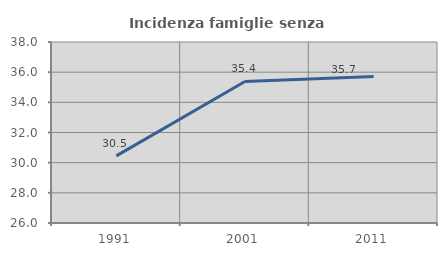
| Category | Incidenza famiglie senza nuclei |
|---|---|
| 1991.0 | 30.451 |
| 2001.0 | 35.385 |
| 2011.0 | 35.714 |